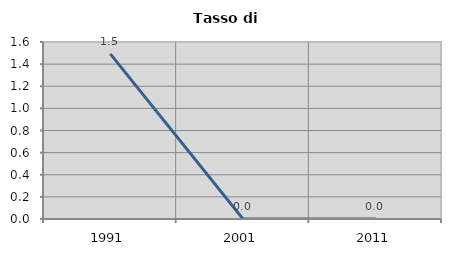
| Category | Tasso di disoccupazione   |
|---|---|
| 1991.0 | 1.493 |
| 2001.0 | 0 |
| 2011.0 | 0 |